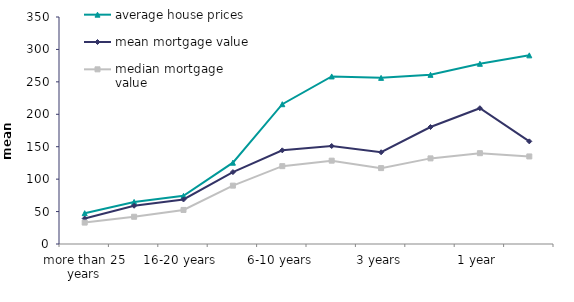
| Category | average house prices | mean mortgage value | median mortgage value |
|---|---|---|---|
| more than 25 years | 47.507 | 39.256 | 33 |
| 21-25 years  | 64.851 | 58.963 | 42 |
| 16-20 years  | 74.264 | 68.655 | 52.5 |
| 11-15 years | 125.358 | 110.85 | 90 |
| 6-10 years | 215.524 | 144.417 | 120 |
| 4-5 years  | 258.365 | 151.096 | 128.5 |
| 3 years | 256.151 | 141.464 | 117 |
| 2 years | 260.85 | 180.365 | 132 |
| 1 year | 277.863 | 209.362 | 140 |
| within last year | 290.874 | 158.28 | 135 |